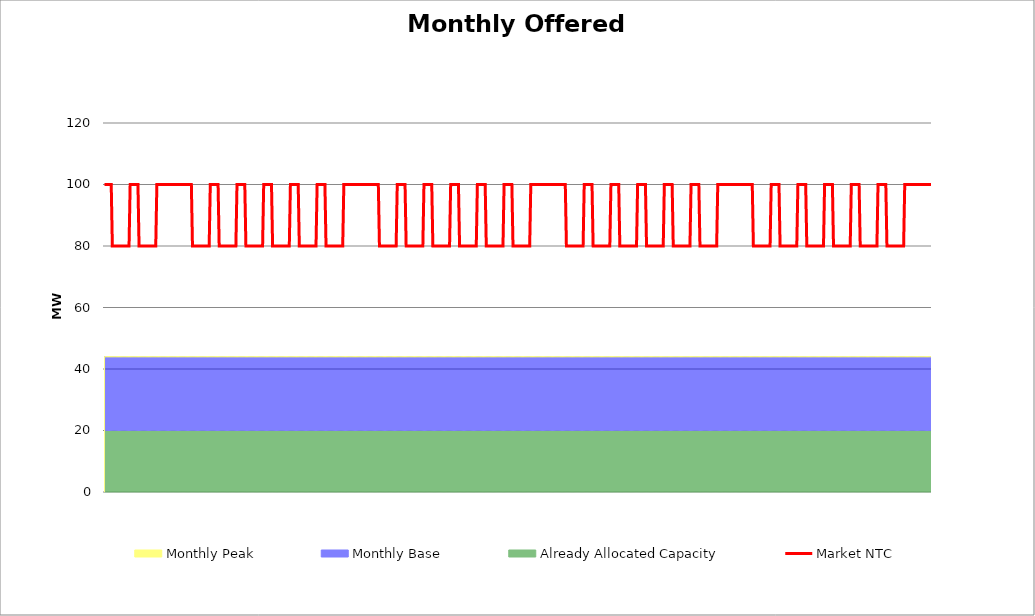
| Category | Market NTC |
|---|---|
| 0 | 100 |
| 1 | 100 |
| 2 | 100 |
| 3 | 100 |
| 4 | 100 |
| 5 | 100 |
| 6 | 100 |
| 7 | 80 |
| 8 | 80 |
| 9 | 80 |
| 10 | 80 |
| 11 | 80 |
| 12 | 80 |
| 13 | 80 |
| 14 | 80 |
| 15 | 80 |
| 16 | 80 |
| 17 | 80 |
| 18 | 80 |
| 19 | 80 |
| 20 | 80 |
| 21 | 80 |
| 22 | 80 |
| 23 | 100 |
| 24 | 100 |
| 25 | 100 |
| 26 | 100 |
| 27 | 100 |
| 28 | 100 |
| 29 | 100 |
| 30 | 100 |
| 31 | 80 |
| 32 | 80 |
| 33 | 80 |
| 34 | 80 |
| 35 | 80 |
| 36 | 80 |
| 37 | 80 |
| 38 | 80 |
| 39 | 80 |
| 40 | 80 |
| 41 | 80 |
| 42 | 80 |
| 43 | 80 |
| 44 | 80 |
| 45 | 80 |
| 46 | 80 |
| 47 | 100 |
| 48 | 100 |
| 49 | 100 |
| 50 | 100 |
| 51 | 100 |
| 52 | 100 |
| 53 | 100 |
| 54 | 100 |
| 55 | 100 |
| 56 | 100 |
| 57 | 100 |
| 58 | 100 |
| 59 | 100 |
| 60 | 100 |
| 61 | 100 |
| 62 | 100 |
| 63 | 100 |
| 64 | 100 |
| 65 | 100 |
| 66 | 100 |
| 67 | 100 |
| 68 | 100 |
| 69 | 100 |
| 70 | 100 |
| 71 | 100 |
| 72 | 100 |
| 73 | 100 |
| 74 | 100 |
| 75 | 100 |
| 76 | 100 |
| 77 | 100 |
| 78 | 100 |
| 79 | 80 |
| 80 | 80 |
| 81 | 80 |
| 82 | 80 |
| 83 | 80 |
| 84 | 80 |
| 85 | 80 |
| 86 | 80 |
| 87 | 80 |
| 88 | 80 |
| 89 | 80 |
| 90 | 80 |
| 91 | 80 |
| 92 | 80 |
| 93 | 80 |
| 94 | 80 |
| 95 | 100 |
| 96 | 100 |
| 97 | 100 |
| 98 | 100 |
| 99 | 100 |
| 100 | 100 |
| 101 | 100 |
| 102 | 100 |
| 103 | 80 |
| 104 | 80 |
| 105 | 80 |
| 106 | 80 |
| 107 | 80 |
| 108 | 80 |
| 109 | 80 |
| 110 | 80 |
| 111 | 80 |
| 112 | 80 |
| 113 | 80 |
| 114 | 80 |
| 115 | 80 |
| 116 | 80 |
| 117 | 80 |
| 118 | 80 |
| 119 | 100 |
| 120 | 100 |
| 121 | 100 |
| 122 | 100 |
| 123 | 100 |
| 124 | 100 |
| 125 | 100 |
| 126 | 100 |
| 127 | 80 |
| 128 | 80 |
| 129 | 80 |
| 130 | 80 |
| 131 | 80 |
| 132 | 80 |
| 133 | 80 |
| 134 | 80 |
| 135 | 80 |
| 136 | 80 |
| 137 | 80 |
| 138 | 80 |
| 139 | 80 |
| 140 | 80 |
| 141 | 80 |
| 142 | 80 |
| 143 | 100 |
| 144 | 100 |
| 145 | 100 |
| 146 | 100 |
| 147 | 100 |
| 148 | 100 |
| 149 | 100 |
| 150 | 100 |
| 151 | 80 |
| 152 | 80 |
| 153 | 80 |
| 154 | 80 |
| 155 | 80 |
| 156 | 80 |
| 157 | 80 |
| 158 | 80 |
| 159 | 80 |
| 160 | 80 |
| 161 | 80 |
| 162 | 80 |
| 163 | 80 |
| 164 | 80 |
| 165 | 80 |
| 166 | 80 |
| 167 | 100 |
| 168 | 100 |
| 169 | 100 |
| 170 | 100 |
| 171 | 100 |
| 172 | 100 |
| 173 | 100 |
| 174 | 100 |
| 175 | 80 |
| 176 | 80 |
| 177 | 80 |
| 178 | 80 |
| 179 | 80 |
| 180 | 80 |
| 181 | 80 |
| 182 | 80 |
| 183 | 80 |
| 184 | 80 |
| 185 | 80 |
| 186 | 80 |
| 187 | 80 |
| 188 | 80 |
| 189 | 80 |
| 190 | 80 |
| 191 | 100 |
| 192 | 100 |
| 193 | 100 |
| 194 | 100 |
| 195 | 100 |
| 196 | 100 |
| 197 | 100 |
| 198 | 100 |
| 199 | 80 |
| 200 | 80 |
| 201 | 80 |
| 202 | 80 |
| 203 | 80 |
| 204 | 80 |
| 205 | 80 |
| 206 | 80 |
| 207 | 80 |
| 208 | 80 |
| 209 | 80 |
| 210 | 80 |
| 211 | 80 |
| 212 | 80 |
| 213 | 80 |
| 214 | 80 |
| 215 | 100 |
| 216 | 100 |
| 217 | 100 |
| 218 | 100 |
| 219 | 100 |
| 220 | 100 |
| 221 | 100 |
| 222 | 100 |
| 223 | 100 |
| 224 | 100 |
| 225 | 100 |
| 226 | 100 |
| 227 | 100 |
| 228 | 100 |
| 229 | 100 |
| 230 | 100 |
| 231 | 100 |
| 232 | 100 |
| 233 | 100 |
| 234 | 100 |
| 235 | 100 |
| 236 | 100 |
| 237 | 100 |
| 238 | 100 |
| 239 | 100 |
| 240 | 100 |
| 241 | 100 |
| 242 | 100 |
| 243 | 100 |
| 244 | 100 |
| 245 | 100 |
| 246 | 100 |
| 247 | 80 |
| 248 | 80 |
| 249 | 80 |
| 250 | 80 |
| 251 | 80 |
| 252 | 80 |
| 253 | 80 |
| 254 | 80 |
| 255 | 80 |
| 256 | 80 |
| 257 | 80 |
| 258 | 80 |
| 259 | 80 |
| 260 | 80 |
| 261 | 80 |
| 262 | 80 |
| 263 | 100 |
| 264 | 100 |
| 265 | 100 |
| 266 | 100 |
| 267 | 100 |
| 268 | 100 |
| 269 | 100 |
| 270 | 100 |
| 271 | 80 |
| 272 | 80 |
| 273 | 80 |
| 274 | 80 |
| 275 | 80 |
| 276 | 80 |
| 277 | 80 |
| 278 | 80 |
| 279 | 80 |
| 280 | 80 |
| 281 | 80 |
| 282 | 80 |
| 283 | 80 |
| 284 | 80 |
| 285 | 80 |
| 286 | 80 |
| 287 | 100 |
| 288 | 100 |
| 289 | 100 |
| 290 | 100 |
| 291 | 100 |
| 292 | 100 |
| 293 | 100 |
| 294 | 100 |
| 295 | 80 |
| 296 | 80 |
| 297 | 80 |
| 298 | 80 |
| 299 | 80 |
| 300 | 80 |
| 301 | 80 |
| 302 | 80 |
| 303 | 80 |
| 304 | 80 |
| 305 | 80 |
| 306 | 80 |
| 307 | 80 |
| 308 | 80 |
| 309 | 80 |
| 310 | 80 |
| 311 | 100 |
| 312 | 100 |
| 313 | 100 |
| 314 | 100 |
| 315 | 100 |
| 316 | 100 |
| 317 | 100 |
| 318 | 100 |
| 319 | 80 |
| 320 | 80 |
| 321 | 80 |
| 322 | 80 |
| 323 | 80 |
| 324 | 80 |
| 325 | 80 |
| 326 | 80 |
| 327 | 80 |
| 328 | 80 |
| 329 | 80 |
| 330 | 80 |
| 331 | 80 |
| 332 | 80 |
| 333 | 80 |
| 334 | 80 |
| 335 | 100 |
| 336 | 100 |
| 337 | 100 |
| 338 | 100 |
| 339 | 100 |
| 340 | 100 |
| 341 | 100 |
| 342 | 100 |
| 343 | 80 |
| 344 | 80 |
| 345 | 80 |
| 346 | 80 |
| 347 | 80 |
| 348 | 80 |
| 349 | 80 |
| 350 | 80 |
| 351 | 80 |
| 352 | 80 |
| 353 | 80 |
| 354 | 80 |
| 355 | 80 |
| 356 | 80 |
| 357 | 80 |
| 358 | 80 |
| 359 | 100 |
| 360 | 100 |
| 361 | 100 |
| 362 | 100 |
| 363 | 100 |
| 364 | 100 |
| 365 | 100 |
| 366 | 100 |
| 367 | 80 |
| 368 | 80 |
| 369 | 80 |
| 370 | 80 |
| 371 | 80 |
| 372 | 80 |
| 373 | 80 |
| 374 | 80 |
| 375 | 80 |
| 376 | 80 |
| 377 | 80 |
| 378 | 80 |
| 379 | 80 |
| 380 | 80 |
| 381 | 80 |
| 382 | 80 |
| 383 | 100 |
| 384 | 100 |
| 385 | 100 |
| 386 | 100 |
| 387 | 100 |
| 388 | 100 |
| 389 | 100 |
| 390 | 100 |
| 391 | 100 |
| 392 | 100 |
| 393 | 100 |
| 394 | 100 |
| 395 | 100 |
| 396 | 100 |
| 397 | 100 |
| 398 | 100 |
| 399 | 100 |
| 400 | 100 |
| 401 | 100 |
| 402 | 100 |
| 403 | 100 |
| 404 | 100 |
| 405 | 100 |
| 406 | 100 |
| 407 | 100 |
| 408 | 100 |
| 409 | 100 |
| 410 | 100 |
| 411 | 100 |
| 412 | 100 |
| 413 | 100 |
| 414 | 100 |
| 415 | 80 |
| 416 | 80 |
| 417 | 80 |
| 418 | 80 |
| 419 | 80 |
| 420 | 80 |
| 421 | 80 |
| 422 | 80 |
| 423 | 80 |
| 424 | 80 |
| 425 | 80 |
| 426 | 80 |
| 427 | 80 |
| 428 | 80 |
| 429 | 80 |
| 430 | 80 |
| 431 | 100 |
| 432 | 100 |
| 433 | 100 |
| 434 | 100 |
| 435 | 100 |
| 436 | 100 |
| 437 | 100 |
| 438 | 100 |
| 439 | 80 |
| 440 | 80 |
| 441 | 80 |
| 442 | 80 |
| 443 | 80 |
| 444 | 80 |
| 445 | 80 |
| 446 | 80 |
| 447 | 80 |
| 448 | 80 |
| 449 | 80 |
| 450 | 80 |
| 451 | 80 |
| 452 | 80 |
| 453 | 80 |
| 454 | 80 |
| 455 | 100 |
| 456 | 100 |
| 457 | 100 |
| 458 | 100 |
| 459 | 100 |
| 460 | 100 |
| 461 | 100 |
| 462 | 100 |
| 463 | 80 |
| 464 | 80 |
| 465 | 80 |
| 466 | 80 |
| 467 | 80 |
| 468 | 80 |
| 469 | 80 |
| 470 | 80 |
| 471 | 80 |
| 472 | 80 |
| 473 | 80 |
| 474 | 80 |
| 475 | 80 |
| 476 | 80 |
| 477 | 80 |
| 478 | 80 |
| 479 | 100 |
| 480 | 100 |
| 481 | 100 |
| 482 | 100 |
| 483 | 100 |
| 484 | 100 |
| 485 | 100 |
| 486 | 100 |
| 487 | 80 |
| 488 | 80 |
| 489 | 80 |
| 490 | 80 |
| 491 | 80 |
| 492 | 80 |
| 493 | 80 |
| 494 | 80 |
| 495 | 80 |
| 496 | 80 |
| 497 | 80 |
| 498 | 80 |
| 499 | 80 |
| 500 | 80 |
| 501 | 80 |
| 502 | 80 |
| 503 | 100 |
| 504 | 100 |
| 505 | 100 |
| 506 | 100 |
| 507 | 100 |
| 508 | 100 |
| 509 | 100 |
| 510 | 100 |
| 511 | 80 |
| 512 | 80 |
| 513 | 80 |
| 514 | 80 |
| 515 | 80 |
| 516 | 80 |
| 517 | 80 |
| 518 | 80 |
| 519 | 80 |
| 520 | 80 |
| 521 | 80 |
| 522 | 80 |
| 523 | 80 |
| 524 | 80 |
| 525 | 80 |
| 526 | 80 |
| 527 | 100 |
| 528 | 100 |
| 529 | 100 |
| 530 | 100 |
| 531 | 100 |
| 532 | 100 |
| 533 | 100 |
| 534 | 100 |
| 535 | 80 |
| 536 | 80 |
| 537 | 80 |
| 538 | 80 |
| 539 | 80 |
| 540 | 80 |
| 541 | 80 |
| 542 | 80 |
| 543 | 80 |
| 544 | 80 |
| 545 | 80 |
| 546 | 80 |
| 547 | 80 |
| 548 | 80 |
| 549 | 80 |
| 550 | 80 |
| 551 | 100 |
| 552 | 100 |
| 553 | 100 |
| 554 | 100 |
| 555 | 100 |
| 556 | 100 |
| 557 | 100 |
| 558 | 100 |
| 559 | 100 |
| 560 | 100 |
| 561 | 100 |
| 562 | 100 |
| 563 | 100 |
| 564 | 100 |
| 565 | 100 |
| 566 | 100 |
| 567 | 100 |
| 568 | 100 |
| 569 | 100 |
| 570 | 100 |
| 571 | 100 |
| 572 | 100 |
| 573 | 100 |
| 574 | 100 |
| 575 | 100 |
| 576 | 100 |
| 577 | 100 |
| 578 | 100 |
| 579 | 100 |
| 580 | 100 |
| 581 | 100 |
| 582 | 100 |
| 583 | 80 |
| 584 | 80 |
| 585 | 80 |
| 586 | 80 |
| 587 | 80 |
| 588 | 80 |
| 589 | 80 |
| 590 | 80 |
| 591 | 80 |
| 592 | 80 |
| 593 | 80 |
| 594 | 80 |
| 595 | 80 |
| 596 | 80 |
| 597 | 80 |
| 598 | 80 |
| 599 | 100 |
| 600 | 100 |
| 601 | 100 |
| 602 | 100 |
| 603 | 100 |
| 604 | 100 |
| 605 | 100 |
| 606 | 100 |
| 607 | 80 |
| 608 | 80 |
| 609 | 80 |
| 610 | 80 |
| 611 | 80 |
| 612 | 80 |
| 613 | 80 |
| 614 | 80 |
| 615 | 80 |
| 616 | 80 |
| 617 | 80 |
| 618 | 80 |
| 619 | 80 |
| 620 | 80 |
| 621 | 80 |
| 622 | 80 |
| 623 | 100 |
| 624 | 100 |
| 625 | 100 |
| 626 | 100 |
| 627 | 100 |
| 628 | 100 |
| 629 | 100 |
| 630 | 100 |
| 631 | 80 |
| 632 | 80 |
| 633 | 80 |
| 634 | 80 |
| 635 | 80 |
| 636 | 80 |
| 637 | 80 |
| 638 | 80 |
| 639 | 80 |
| 640 | 80 |
| 641 | 80 |
| 642 | 80 |
| 643 | 80 |
| 644 | 80 |
| 645 | 80 |
| 646 | 80 |
| 647 | 100 |
| 648 | 100 |
| 649 | 100 |
| 650 | 100 |
| 651 | 100 |
| 652 | 100 |
| 653 | 100 |
| 654 | 100 |
| 655 | 80 |
| 656 | 80 |
| 657 | 80 |
| 658 | 80 |
| 659 | 80 |
| 660 | 80 |
| 661 | 80 |
| 662 | 80 |
| 663 | 80 |
| 664 | 80 |
| 665 | 80 |
| 666 | 80 |
| 667 | 80 |
| 668 | 80 |
| 669 | 80 |
| 670 | 80 |
| 671 | 100 |
| 672 | 100 |
| 673 | 100 |
| 674 | 100 |
| 675 | 100 |
| 676 | 100 |
| 677 | 100 |
| 678 | 100 |
| 679 | 80 |
| 680 | 80 |
| 681 | 80 |
| 682 | 80 |
| 683 | 80 |
| 684 | 80 |
| 685 | 80 |
| 686 | 80 |
| 687 | 80 |
| 688 | 80 |
| 689 | 80 |
| 690 | 80 |
| 691 | 80 |
| 692 | 80 |
| 693 | 80 |
| 694 | 80 |
| 695 | 100 |
| 696 | 100 |
| 697 | 100 |
| 698 | 100 |
| 699 | 100 |
| 700 | 100 |
| 701 | 100 |
| 702 | 100 |
| 703 | 80 |
| 704 | 80 |
| 705 | 80 |
| 706 | 80 |
| 707 | 80 |
| 708 | 80 |
| 709 | 80 |
| 710 | 80 |
| 711 | 80 |
| 712 | 80 |
| 713 | 80 |
| 714 | 80 |
| 715 | 80 |
| 716 | 80 |
| 717 | 80 |
| 718 | 80 |
| 719 | 100 |
| 720 | 100 |
| 721 | 100 |
| 722 | 100 |
| 723 | 100 |
| 724 | 100 |
| 725 | 100 |
| 726 | 100 |
| 727 | 100 |
| 728 | 100 |
| 729 | 100 |
| 730 | 100 |
| 731 | 100 |
| 732 | 100 |
| 733 | 100 |
| 734 | 100 |
| 735 | 100 |
| 736 | 100 |
| 737 | 100 |
| 738 | 100 |
| 739 | 100 |
| 740 | 100 |
| 741 | 100 |
| 742 | 100 |
| 743 | 100 |